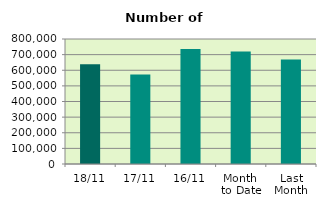
| Category | Series 0 |
|---|---|
| 18/11 | 637804 |
| 17/11 | 572616 |
| 16/11 | 735920 |
| Month 
to Date | 720084.857 |
| Last
Month | 669366.857 |